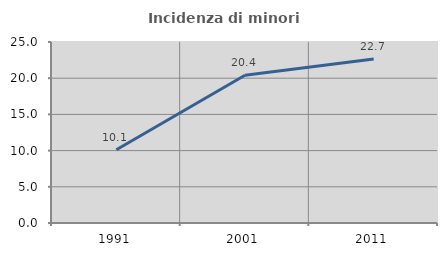
| Category | Incidenza di minori stranieri |
|---|---|
| 1991.0 | 10.117 |
| 2001.0 | 20.402 |
| 2011.0 | 22.661 |